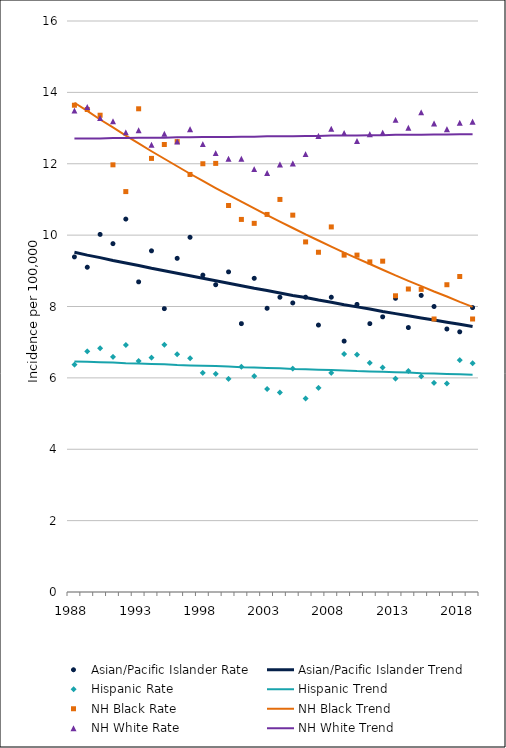
| Category | Asian/Pacific Islander Rate | Asian/Pacific Islander Trend | Hispanic Rate | Hispanic Trend | NH Black Rate | NH Black Trend | NH White Rate | NH White Trend |
|---|---|---|---|---|---|---|---|---|
| 1988.0 | 9.39 | 9.52 | 6.37 | 6.46 | 13.64 | 13.71 | 13.49 | 12.71 |
| 1989.0 | 9.1 | 9.44 | 6.74 | 6.45 | 13.52 | 13.48 | 13.59 | 12.71 |
| 1990.0 | 10.02 | 9.37 | 6.83 | 6.44 | 13.36 | 13.24 | 13.28 | 12.71 |
| 1991.0 | 9.76 | 9.29 | 6.59 | 6.43 | 11.97 | 13.02 | 13.19 | 12.72 |
| 1992.0 | 10.45 | 9.22 | 6.92 | 6.41 | 11.22 | 12.79 | 12.88 | 12.72 |
| 1993.0 | 8.69 | 9.15 | 6.47 | 6.4 | 13.54 | 12.57 | 12.94 | 12.73 |
| 1994.0 | 9.56 | 9.07 | 6.57 | 6.39 | 12.15 | 12.35 | 12.53 | 12.73 |
| 1995.0 | 7.94 | 9 | 6.93 | 6.38 | 12.54 | 12.14 | 12.84 | 12.73 |
| 1996.0 | 9.35 | 8.93 | 6.66 | 6.36 | 12.62 | 11.93 | 12.62 | 12.74 |
| 1997.0 | 9.94 | 8.86 | 6.55 | 6.35 | 11.7 | 11.72 | 12.97 | 12.74 |
| 1998.0 | 8.88 | 8.79 | 6.14 | 6.34 | 12 | 11.52 | 12.55 | 12.75 |
| 1999.0 | 8.61 | 8.72 | 6.11 | 6.33 | 12.01 | 11.32 | 12.3 | 12.75 |
| 2000.0 | 8.97 | 8.65 | 5.97 | 6.32 | 10.83 | 11.13 | 12.14 | 12.75 |
| 2001.0 | 7.52 | 8.58 | 6.31 | 6.3 | 10.44 | 10.94 | 12.14 | 12.76 |
| 2002.0 | 8.79 | 8.51 | 6.05 | 6.29 | 10.33 | 10.75 | 11.85 | 12.76 |
| 2003.0 | 7.95 | 8.45 | 5.69 | 6.28 | 10.58 | 10.56 | 11.74 | 12.77 |
| 2004.0 | 8.26 | 8.38 | 5.59 | 6.27 | 11 | 10.38 | 11.98 | 12.77 |
| 2005.0 | 8.1 | 8.31 | 6.26 | 6.25 | 10.56 | 10.2 | 12.01 | 12.77 |
| 2006.0 | 8.26 | 8.25 | 5.42 | 6.24 | 9.81 | 10.02 | 12.27 | 12.78 |
| 2007.0 | 7.48 | 8.18 | 5.72 | 6.23 | 9.52 | 9.85 | 12.78 | 12.78 |
| 2008.0 | 8.26 | 8.12 | 6.14 | 6.22 | 10.23 | 9.68 | 12.98 | 12.79 |
| 2009.0 | 7.03 | 8.05 | 6.67 | 6.21 | 9.44 | 9.51 | 12.86 | 12.79 |
| 2010.0 | 8.06 | 7.99 | 6.65 | 6.19 | 9.44 | 9.35 | 12.64 | 12.79 |
| 2011.0 | 7.52 | 7.93 | 6.42 | 6.18 | 9.25 | 9.19 | 12.83 | 12.8 |
| 2012.0 | 7.71 | 7.86 | 6.29 | 6.17 | 9.27 | 9.03 | 12.87 | 12.8 |
| 2013.0 | 8.23 | 7.8 | 5.98 | 6.16 | 8.3 | 8.87 | 13.23 | 12.81 |
| 2014.0 | 7.41 | 7.74 | 6.19 | 6.15 | 8.49 | 8.72 | 13.01 | 12.81 |
| 2015.0 | 8.31 | 7.68 | 6.04 | 6.13 | 8.48 | 8.57 | 13.44 | 12.81 |
| 2016.0 | 8 | 7.62 | 5.86 | 6.12 | 7.65 | 8.42 | 13.13 | 12.82 |
| 2017.0 | 7.37 | 7.56 | 5.84 | 6.11 | 8.61 | 8.28 | 12.97 | 12.82 |
| 2018.0 | 7.29 | 7.5 | 6.5 | 6.1 | 8.84 | 8.13 | 13.15 | 12.83 |
| 2019.0 | 7.97 | 7.44 | 6.41 | 6.09 | 7.65 | 7.99 | 13.18 | 12.83 |